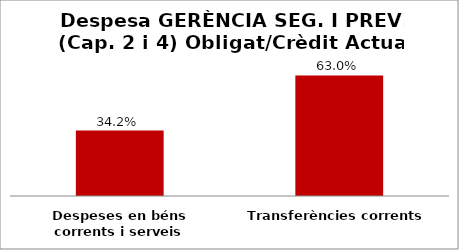
| Category | Series 0 |
|---|---|
| Despeses en béns corrents i serveis | 0.342 |
| Transferències corrents | 0.63 |